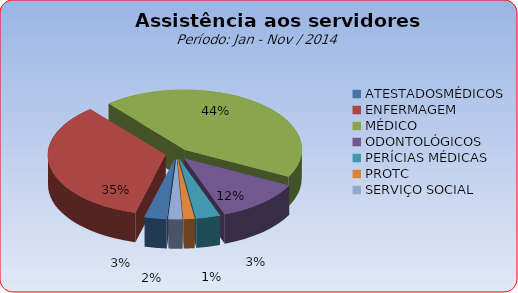
| Category | Series 0 |
|---|---|
| ATESTADOSMÉDICOS | 3.022 |
| ENFERMAGEM | 34.8 |
| MÉDICO | 43.612 |
| ODONTOLÓGICOS | 11.89 |
| PERÍCIAS MÉDICAS | 3.303 |
| PROTC | 1.476 |
| SERVIÇO SOCIAL | 1.897 |